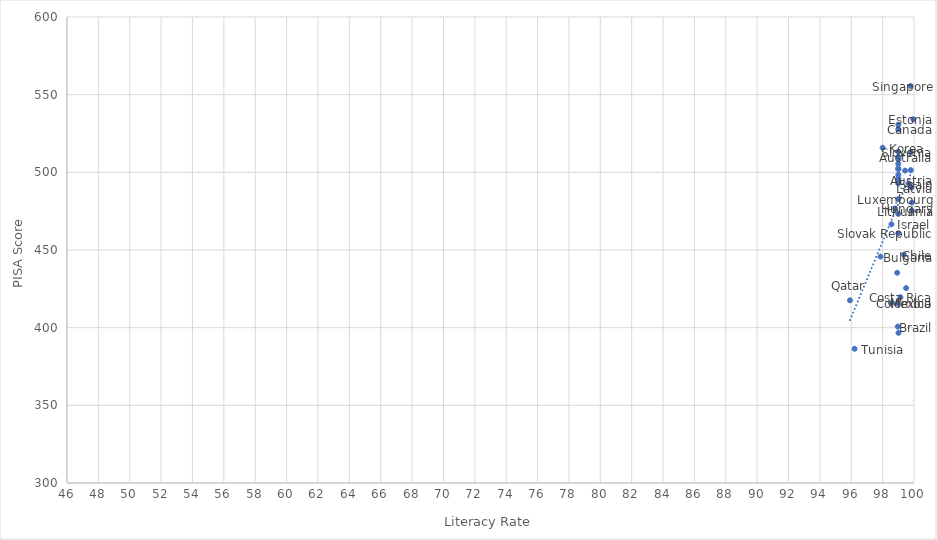
| Category | Series 0 |
|---|---|
| 99.0 | 509.994 |
| 99.0 | 495.037 |
| 98.96375 | 400.682 |
| 97.86505 | 445.772 |
| 99.0 | 527.705 |
| 99.3539399999999 | 446.956 |
| 98.53473 | 415.729 |
| 99.1337 | 419.608 |
| 99.0 | 492.83 |
| 99.0 | 501.937 |
| 99.9489 | 534.194 |
| 99.0 | 530.661 |
| 99.0 | 494.978 |
| 99.0 | 509.141 |
| 98.8 | 476.748 |
| 99.0 | 473.23 |
| 99.0 | 502.575 |
| 98.56286 | 466.553 |
| 99.85964 | 480.547 |
| 98.0 | 515.81 |
| 99.83543 | 490.225 |
| 99.8558 | 475.409 |
| 99.0 | 482.806 |
| 98.94471 | 415.71 |
| 99.0 | 508.575 |
| 99.0 | 513.304 |
| 99.0 | 498.481 |
| 99.00954 | 396.684 |
| 99.79683 | 501.435 |
| 99.43512 | 501.1 |
| 95.92071 | 417.611 |
| 99.7848999999999 | 555.575 |
| 99.0 | 460.775 |
| 99.8 | 512.864 |
| 99.65568 | 492.786 |
| 99.0 | 493.422 |
| 99.0 | 505.506 |
| 96.2091 | 386.403 |
| 99.49439 | 425.49 |
| 99.0 | 509.222 |
| 99.0 | 496.242 |
| 98.9276 | 435.363 |